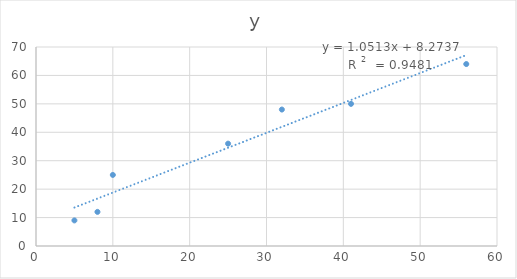
| Category | y |
|---|---|
| 5.0 | 9 |
| 8.0 | 12 |
| 10.0 | 25 |
| 25.0 | 36 |
| 32.0 | 48 |
| 41.0 | 50 |
| 56.0 | 64 |